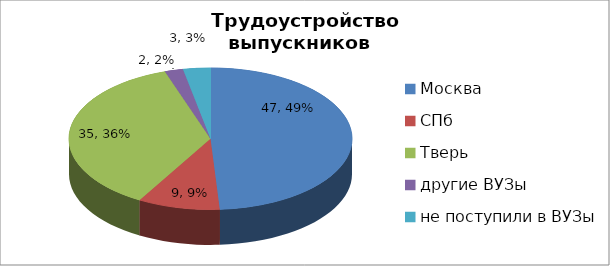
| Category | Series 0 |
|---|---|
| Москва | 47 |
| СПб | 9 |
| Тверь | 35 |
| другие ВУЗы | 2 |
| не поступили в ВУЗы | 3 |